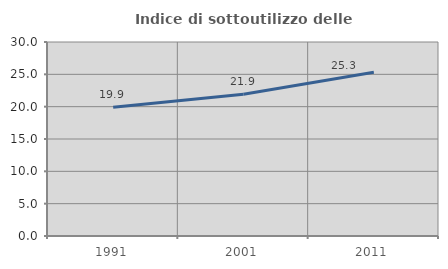
| Category | Indice di sottoutilizzo delle abitazioni  |
|---|---|
| 1991.0 | 19.907 |
| 2001.0 | 21.922 |
| 2011.0 | 25.333 |